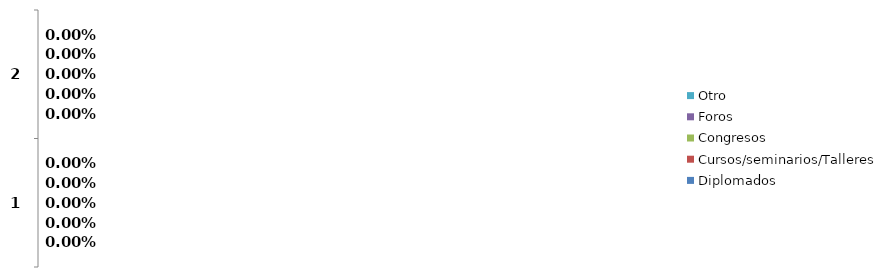
| Category | Diplomados | Cursos/seminarios/Talleres | Congresos | Foros | Otro |
|---|---|---|---|---|---|
| 0 | 0 | 0 | 0 | 0 | 0 |
| 1 | 0 | 0 | 0 | 0 | 0 |